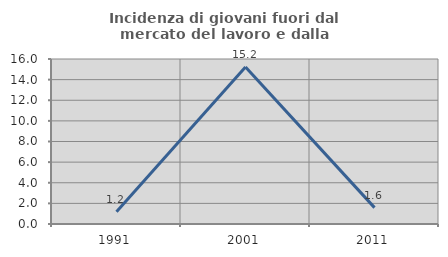
| Category | Incidenza di giovani fuori dal mercato del lavoro e dalla formazione  |
|---|---|
| 1991.0 | 1.19 |
| 2001.0 | 15.217 |
| 2011.0 | 1.587 |